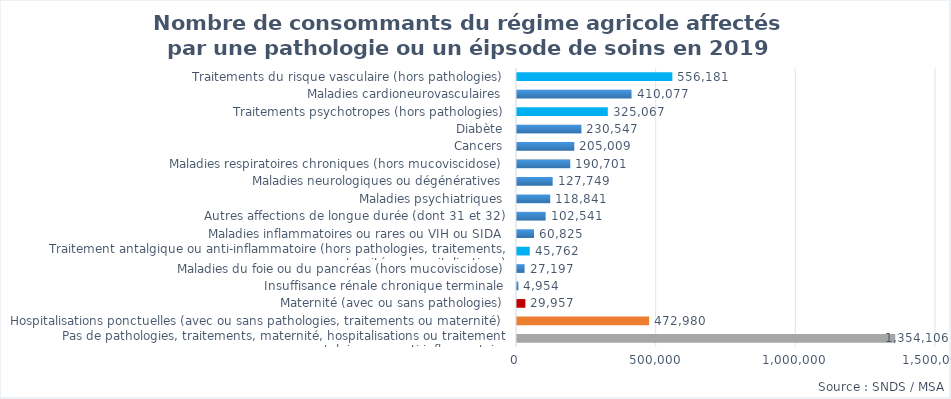
| Category | Series 0 |
|---|---|
| Pas de pathologies, traitements, maternité, hospitalisations ou traitement antalgique ou anti-inflammatoire | 1354106 |
| Hospitalisations ponctuelles (avec ou sans pathologies, traitements ou maternité) | 472980 |
| Maternité (avec ou sans pathologies) | 29957 |
| Insuffisance rénale chronique terminale | 4954 |
| Maladies du foie ou du pancréas (hors mucoviscidose) | 27197 |
| Traitement antalgique ou anti-inflammatoire (hors pathologies, traitements, maternité ou hospitalisations) | 45762 |
| Maladies inflammatoires ou rares ou VIH ou SIDA | 60825 |
| Autres affections de longue durée (dont 31 et 32) | 102541 |
| Maladies psychiatriques | 118841 |
| Maladies neurologiques ou dégénératives | 127749 |
| Maladies respiratoires chroniques (hors mucoviscidose) | 190701 |
| Cancers | 205009 |
| Diabète | 230547 |
| Traitements psychotropes (hors pathologies) | 325067 |
| Maladies cardioneurovasculaires | 410077 |
| Traitements du risque vasculaire (hors pathologies) | 556181 |